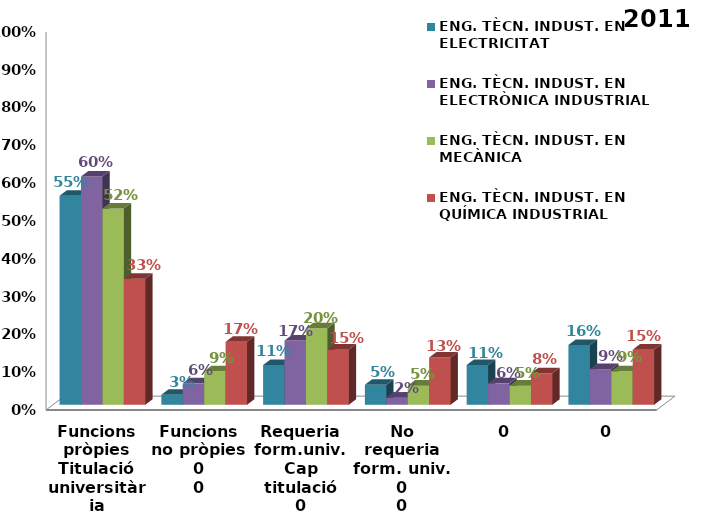
| Category | ENG. TÈCN. INDUST. EN ELECTRICITAT | ENG. TÈCN. INDUST. EN ELECTRÒNICA INDUSTRIAL | ENG. TÈCN. INDUST. EN MECÀNICA | ENG. TÈCN. INDUST. EN QUÍMICA INDUSTRIAL |
|---|---|---|---|---|
| 0 | 0.553 | 0.604 | 0.519 | 0.333 |
| 1 | 0.026 | 0.057 | 0.089 | 0.167 |
| 2 | 0.105 | 0.17 | 0.203 | 0.146 |
| 3 | 0.053 | 0.019 | 0.051 | 0.125 |
| 4 | 0.105 | 0.057 | 0.051 | 0.083 |
| 5 | 0.158 | 0.094 | 0.089 | 0.146 |